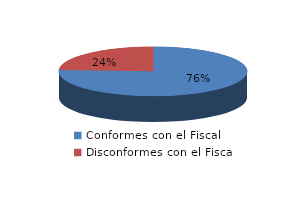
| Category | Series 0 |
|---|---|
| 0 | 60 |
| 1 | 19 |